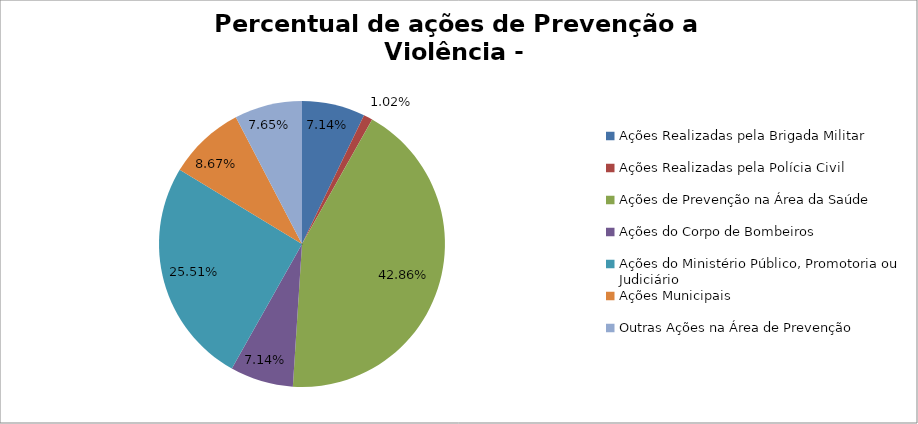
| Category | Percentual |
|---|---|
| Ações Realizadas pela Brigada Militar | 0.071 |
| Ações Realizadas pela Polícia Civil | 0.01 |
| Ações de Prevenção na Área da Saúde | 0.429 |
| Ações do Corpo de Bombeiros | 0.071 |
| Ações do Ministério Público, Promotoria ou Judiciário | 0.255 |
| Ações Municipais | 0.087 |
| Outras Ações na Área de Prevenção | 0.077 |